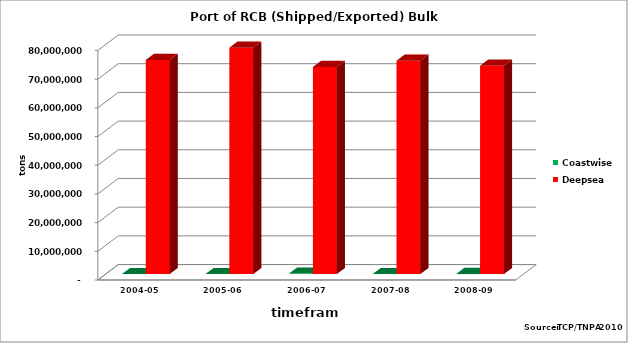
| Category | Coastwise | Deepsea |
|---|---|---|
| 2004-05 | 11494 | 74649316 |
| 2005-06 | 2269 | 78884372 |
| 2006-07 | 169534 | 72212666 |
| 2007-08 | 0 | 74383620 |
| 2008-09 | 26831 | 72606655 |